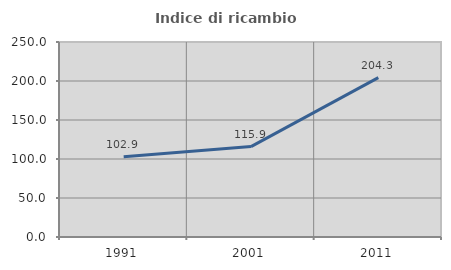
| Category | Indice di ricambio occupazionale  |
|---|---|
| 1991.0 | 102.857 |
| 2001.0 | 115.909 |
| 2011.0 | 204.348 |